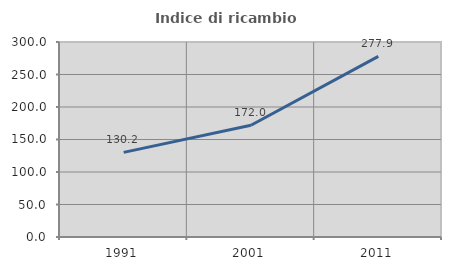
| Category | Indice di ricambio occupazionale  |
|---|---|
| 1991.0 | 130.226 |
| 2001.0 | 172 |
| 2011.0 | 277.856 |